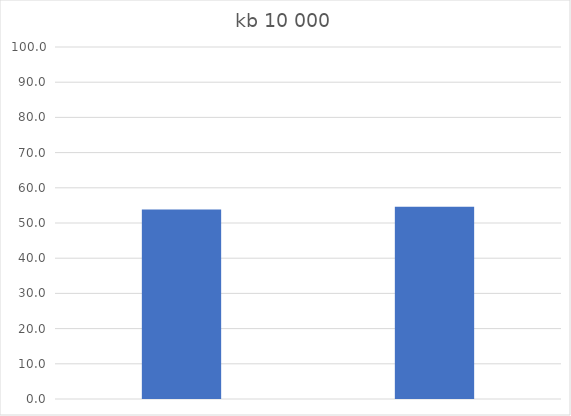
| Category | Series 0 |
|---|---|
| 0 | 53.801 |
| 1 | 54.583 |